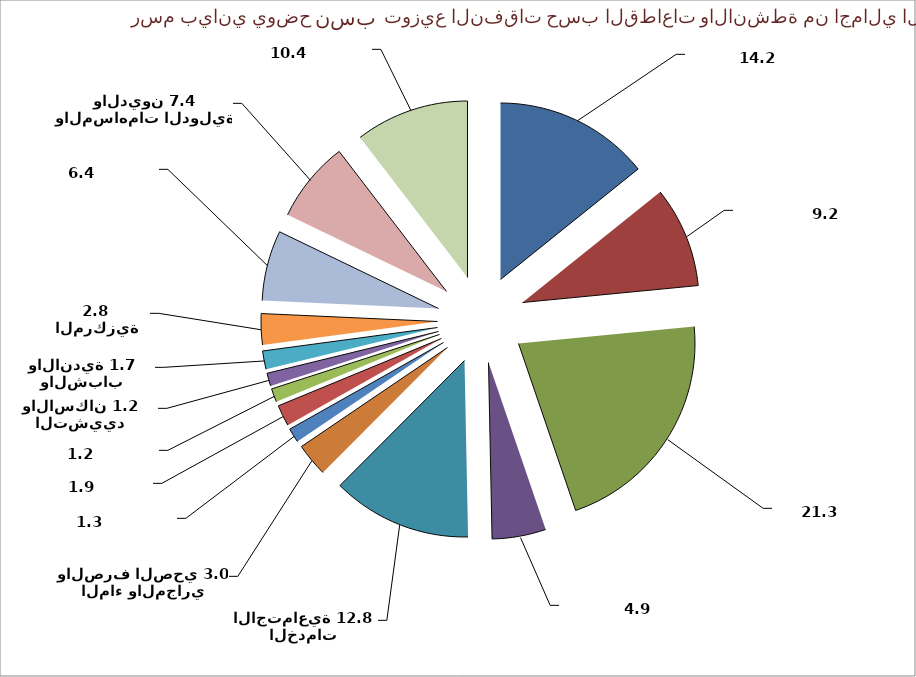
| Category | Series 0 |
|---|---|
| الامن والدفاع | 14.233 |
| التربية والتعليم | 9.235 |
| الطاقة | 21.279 |
| البيئة والصحة | 4.931 |
| الخدمات الاجتماعية | 12.793 |
| الماء والمجاري والصرف الصحي | 3.044 |
| النقل والاتصالات | 1.319 |
| القطاع الزراعي | 1.94 |
| القطاع الصناعي | 1.238 |
| التشييد والاسكان | 1.182 |
| الثقافة والشباب والاندية | 1.681 |
| الادارات العامة المركزية | 2.841 |
| الادارات المحلية | 6.44 |
| الالتزامات والمساهمات الدولية والديون | 7.435 |
| اقليم كردستان | 10.408 |